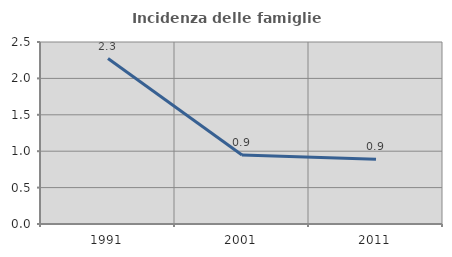
| Category | Incidenza delle famiglie numerose |
|---|---|
| 1991.0 | 2.273 |
| 2001.0 | 0.947 |
| 2011.0 | 0.888 |